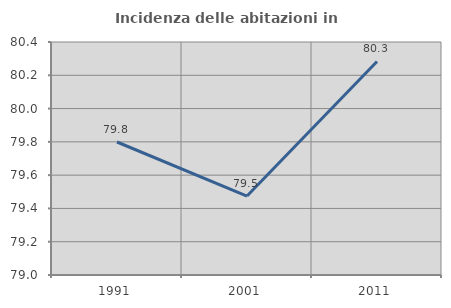
| Category | Incidenza delle abitazioni in proprietà  |
|---|---|
| 1991.0 | 79.799 |
| 2001.0 | 79.474 |
| 2011.0 | 80.283 |